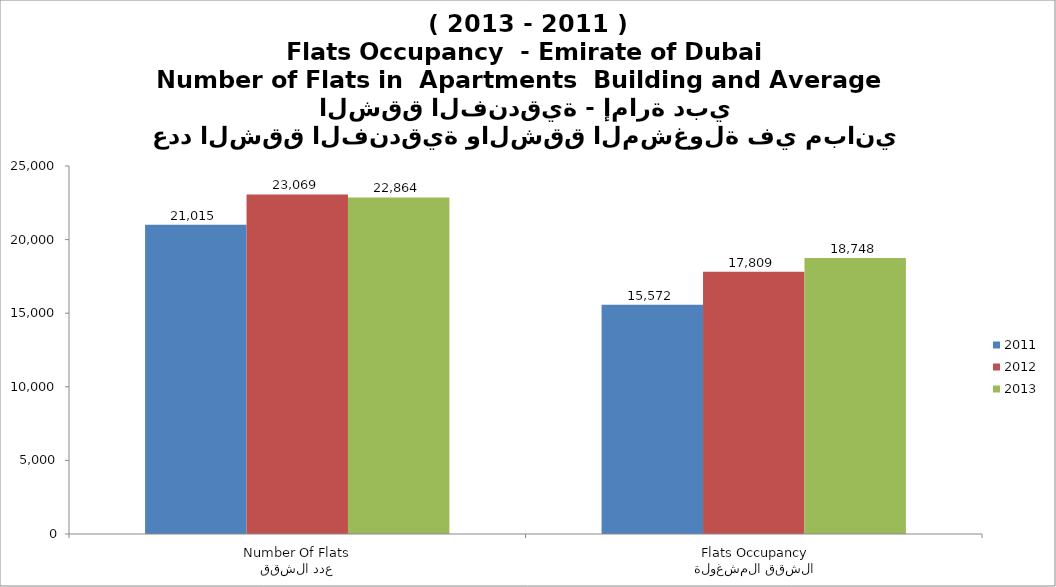
| Category | 2011 | 2012 | 2013 |
|---|---|---|---|
| عدد الشقق
Number Of Flats | 21015 | 23069 | 22864 |
|  الشقق المشغولة
 Flats Occupancy | 15572 | 17809 | 18748 |